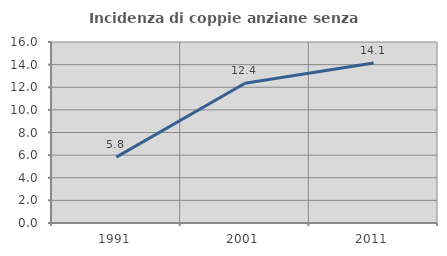
| Category | Incidenza di coppie anziane senza figli  |
|---|---|
| 1991.0 | 5.825 |
| 2001.0 | 12.36 |
| 2011.0 | 14.141 |